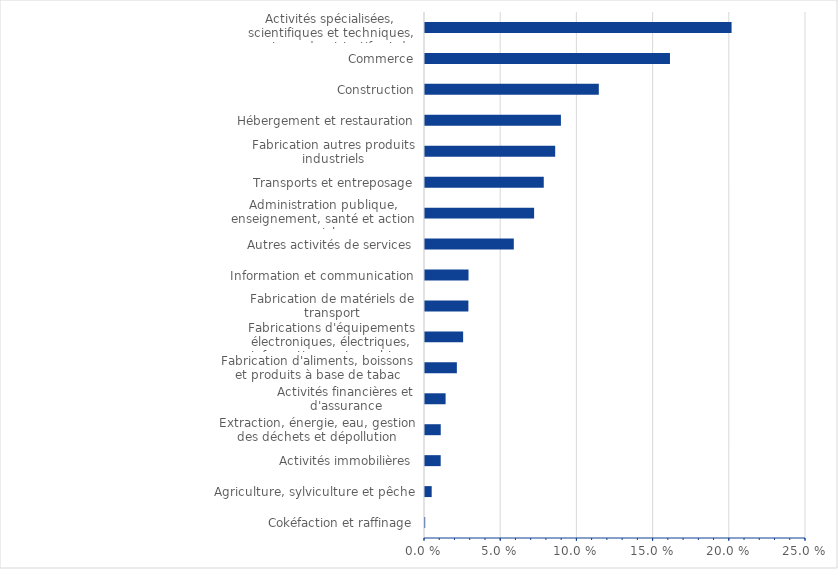
| Category | Series 0 |
|---|---|
| Cokéfaction et raffinage | 0 |
| Agriculture, sylviculture et pêche | 0.004 |
| Activités immobilières | 0.01 |
| Extraction, énergie, eau, gestion des déchets et dépollution | 0.01 |
| Activités financières et d'assurance | 0.014 |
| Fabrication d'aliments, boissons et produits à base de tabac | 0.021 |
| Fabrications d'équipements électroniques, électriques, informatiques et machines | 0.025 |
| Fabrication de matériels de transport | 0.028 |
| Information et communication | 0.029 |
| Autres activités de services | 0.058 |
| Administration publique, enseignement, santé et action sociale | 0.072 |
| Transports et entreposage | 0.078 |
| Fabrication autres produits industriels | 0.085 |
| Hébergement et restauration | 0.089 |
| Construction | 0.114 |
| Commerce | 0.161 |
| Activités spécialisées, scientifiques et techniques, services admnistratifs et de soutien | 0.201 |